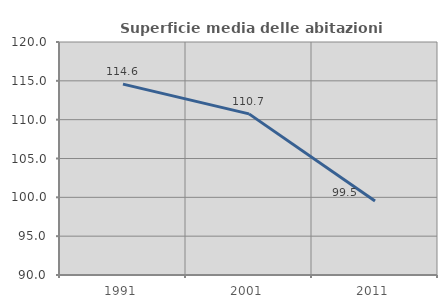
| Category | Superficie media delle abitazioni occupate |
|---|---|
| 1991.0 | 114.58 |
| 2001.0 | 110.745 |
| 2011.0 | 99.536 |